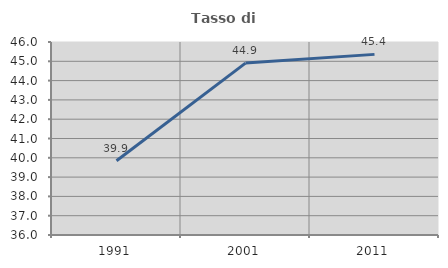
| Category | Tasso di occupazione   |
|---|---|
| 1991.0 | 39.85 |
| 2001.0 | 44.906 |
| 2011.0 | 45.359 |